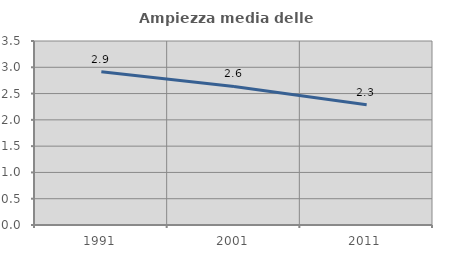
| Category | Ampiezza media delle famiglie |
|---|---|
| 1991.0 | 2.915 |
| 2001.0 | 2.635 |
| 2011.0 | 2.286 |